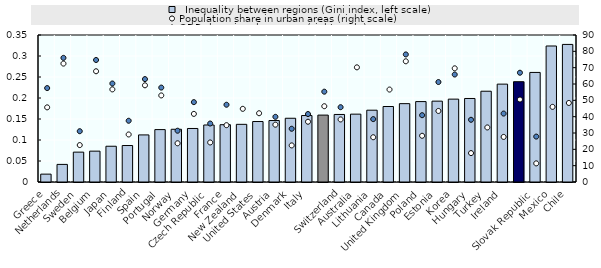
| Category |   Inequality between regions (Gini index, left scale) |
|---|---|
| Greece | 0.019 |
| Netherlands | 0.042 |
| Sweden | 0.071 |
| Belgium | 0.073 |
| Japan | 0.085 |
| Finland | 0.087 |
| Spain | 0.112 |
| Portugal | 0.125 |
| Norway | 0.126 |
| Germany | 0.127 |
| Czech Republic | 0.136 |
| France | 0.136 |
| New Zealand | 0.137 |
| United States | 0.144 |
| Austria | 0.146 |
| Denmark | 0.152 |
| Italy | 0.158 |
|  | 0.159 |
| Switzerland | 0.161 |
| Australia | 0.162 |
| Lithuania | 0.171 |
| Canada | 0.18 |
| United Kingdom | 0.187 |
| Poland | 0.191 |
| Estonia | 0.192 |
| Korea | 0.197 |
| Hungary | 0.199 |
| Turkey | 0.216 |
| Ireland | 0.233 |
|  | 0.239 |
| Slovak Republic | 0.261 |
| Mexico | 0.324 |
| Chile | 0.328 |